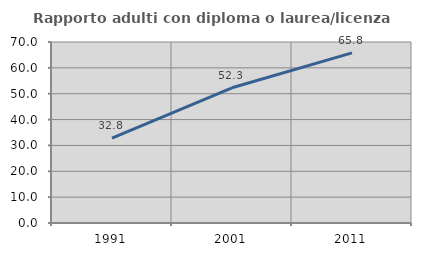
| Category | Rapporto adulti con diploma o laurea/licenza media  |
|---|---|
| 1991.0 | 32.787 |
| 2001.0 | 52.288 |
| 2011.0 | 65.789 |